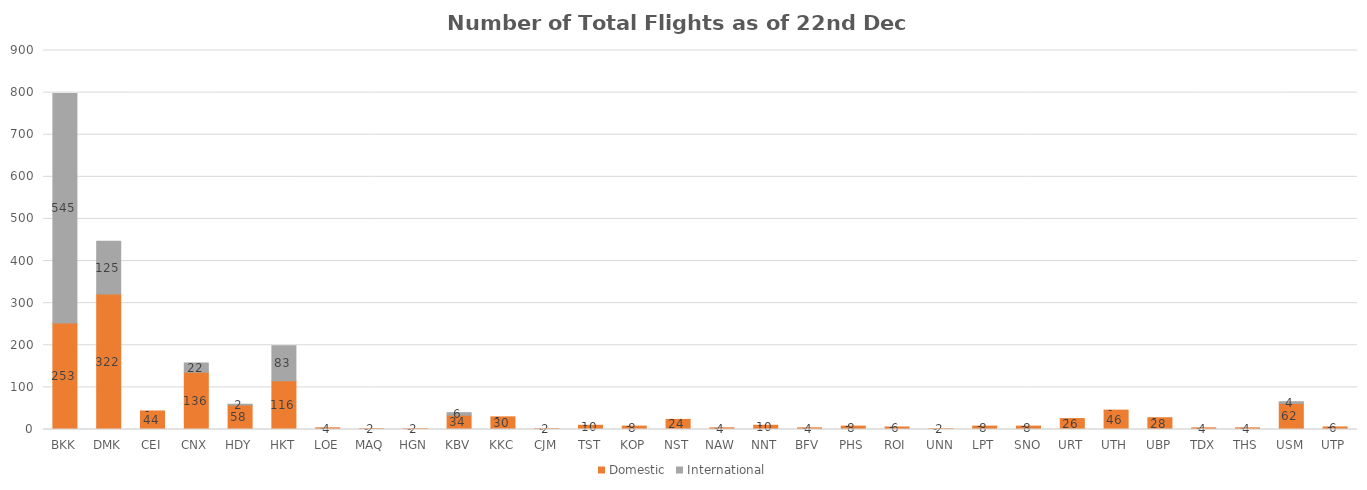
| Category | Domestic | International |
|---|---|---|
| BKK | 253 | 545 |
| DMK | 322 | 125 |
| CEI | 44 | 0 |
| CNX | 136 | 22 |
| HDY | 58 | 2 |
| HKT | 116 | 83 |
| LOE | 4 | 0 |
| MAQ | 2 | 0 |
| HGN | 2 | 0 |
| KBV | 34 | 6 |
| KKC | 30 | 0 |
| CJM | 2 | 0 |
| TST | 10 | 0 |
| KOP | 8 | 0 |
| NST | 24 | 0 |
| NAW | 4 | 0 |
| NNT | 10 | 0 |
| BFV | 4 | 0 |
| PHS | 8 | 0 |
| ROI | 6 | 0 |
| UNN | 2 | 0 |
| LPT | 8 | 0 |
| SNO | 8 | 0 |
| URT | 26 | 0 |
| UTH | 46 | 0 |
| UBP | 28 | 0 |
| TDX | 4 | 0 |
| THS | 4 | 0 |
| USM | 62 | 4 |
| UTP | 6 | 0 |